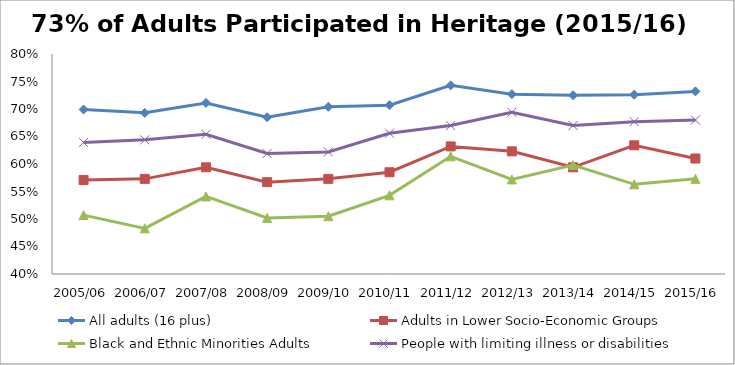
| Category | All adults (16 plus) | Adults in Lower Socio-Economic Groups | Black and Ethnic Minorities Adults | People with limiting illness or disabilities |
|---|---|---|---|---|
| 2005/06 | 0.699 | 0.571 | 0.507 | 0.639 |
| 2006/07 | 0.693 | 0.573 | 0.483 | 0.644 |
| 2007/08 | 0.711 | 0.594 | 0.541 | 0.654 |
| 2008/09 | 0.685 | 0.567 | 0.502 | 0.619 |
| 2009/10 | 0.704 | 0.573 | 0.505 | 0.622 |
| 2010/11 | 0.707 | 0.585 | 0.543 | 0.656 |
| 2011/12 | 0.743 | 0.632 | 0.614 | 0.67 |
| 2012/13 | 0.727 | 0.623 | 0.572 | 0.694 |
| 2013/14 | 0.725 | 0.594 | 0.598 | 0.67 |
| 2014/15 | 0.726 | 0.634 | 0.563 | 0.677 |
| 2015/16 | 0.732 | 0.61 | 0.573 | 0.68 |